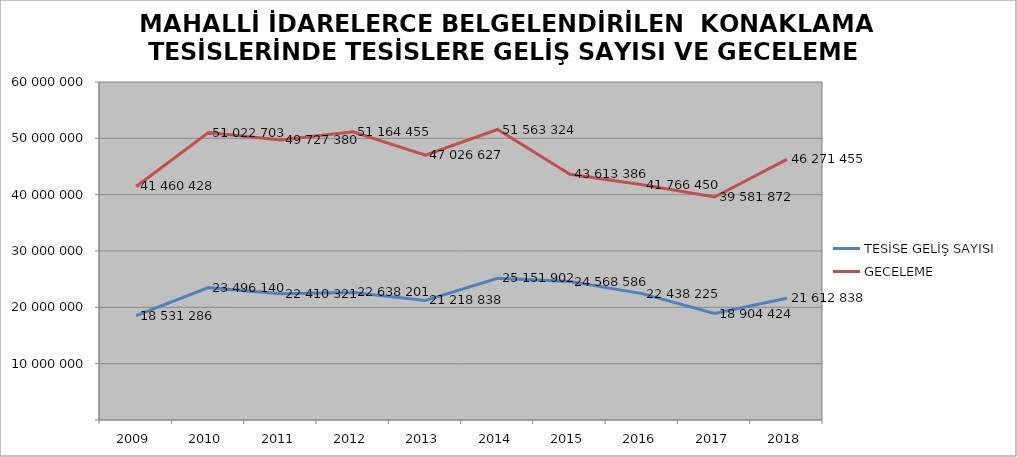
| Category | TESİSE GELİŞ SAYISI | GECELEME |
|---|---|---|
| 2009 | 18531286 | 41460428 |
| 2010 | 23496140 | 51022703 |
| 2011 | 22410321 | 49727380 |
| 2012 | 22638201 | 51164455 |
| 2013 | 21218838 | 47026627 |
| 2014 | 25151902 | 51563324 |
| 2015 | 24568586 | 43613386 |
| 2016 | 22438225 | 41766450 |
| 2017 | 18904424 | 39581872 |
| 2018 | 21612838 | 46271455 |